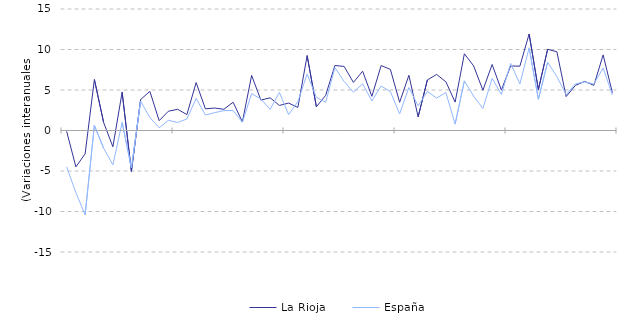
| Category | La Rioja | España |
|---|---|---|
| nan | -0.094 | -4.491 |
| nan | -4.492 | -7.672 |
| nan | -2.881 | -10.413 |
| nan | 6.293 | 0.644 |
| 2013.0 | 0.99 | -2.185 |
| nan | -2.007 | -4.253 |
| nan | 4.736 | 0.992 |
| nan | -5.046 | -4.608 |
| nan | 3.822 | 3.622 |
| nan | 4.837 | 1.593 |
| nan | 1.216 | 0.335 |
| nan | 2.378 | 1.263 |
| nan | 2.618 | 0.986 |
| nan | 1.967 | 1.422 |
| nan | 5.918 | 3.964 |
| nan | 2.677 | 1.909 |
| 2014.0 | 2.773 | 2.202 |
| nan | 2.617 | 2.459 |
| nan | 3.491 | 2.458 |
| nan | 1.066 | 1.01 |
| nan | 6.8 | 4.544 |
| nan | 3.753 | 3.893 |
| nan | 4.036 | 2.605 |
| nan | 3.091 | 4.706 |
| nan | 3.387 | 1.959 |
| nan | 2.847 | 3.566 |
| nan | 9.25 | 6.97 |
| nan | 2.929 | 4.091 |
| 2015.0 | 4.335 | 3.482 |
| nan | 8.021 | 7.764 |
| nan | 7.912 | 6.061 |
| nan | 5.942 | 4.731 |
| nan | 7.319 | 5.767 |
| nan | 4.218 | 3.651 |
| nan | 8.014 | 5.491 |
| nan | 7.545 | 4.81 |
| nan | 3.485 | 2.046 |
| nan | 6.815 | 5.309 |
| nan | 1.679 | 3.042 |
| nan | 6.239 | 4.833 |
| 2016.0 | 6.916 | 4.004 |
| nan | 6.016 | 4.686 |
| nan | 3.505 | 0.788 |
| nan | 9.474 | 6.125 |
| nan | 7.98 | 4.247 |
| nan | 4.973 | 2.717 |
| nan | 8.15 | 6.433 |
| nan | 4.989 | 4.443 |
| nan | 7.962 | 8.287 |
| nan | 7.943 | 5.749 |
| nan | 11.919 | 10.207 |
| nan | 5.043 | 3.859 |
| 2017.0 | 10.026 | 8.427 |
| nan | 9.716 | 6.654 |
| nan | 4.189 | 4.44 |
| nan | 5.563 | 5.758 |
| nan | 6.06 | 6.001 |
| nan | 5.572 | 5.739 |
| nan | 9.333 | 7.722 |